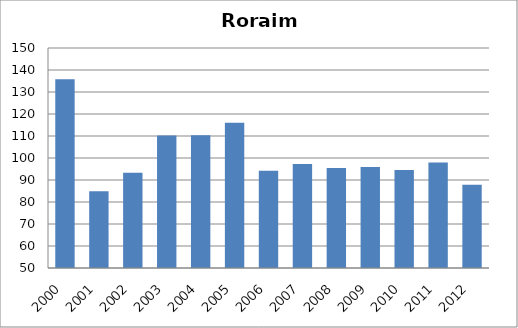
| Category | Tríplice viral/sarampo |
|---|---|
| 2000.0 | 135.75 |
| 2001.0 | 84.9 |
| 2002.0 | 93.31 |
| 2003.0 | 110.22 |
| 2004.0 | 110.32 |
| 2005.0 | 116.01 |
| 2006.0 | 94.23 |
| 2007.0 | 97.31 |
| 2008.0 | 95.51 |
| 2009.0 | 95.95 |
| 2010.0 | 94.49 |
| 2011.0 | 97.98 |
| 2012.0 | 87.83 |